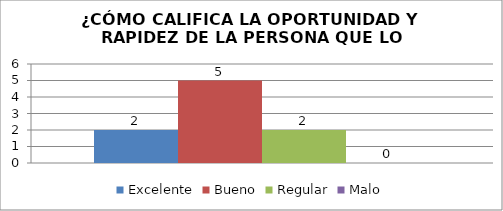
| Category | Excelente | Bueno | Regular | Malo |
|---|---|---|---|---|
| 0 | 2 | 5 | 2 | 0 |